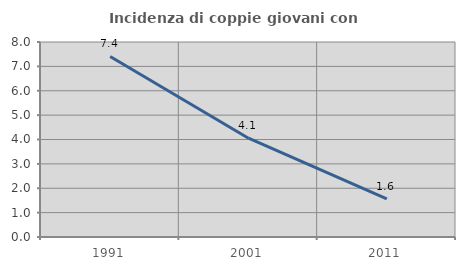
| Category | Incidenza di coppie giovani con figli |
|---|---|
| 1991.0 | 7.407 |
| 2001.0 | 4.054 |
| 2011.0 | 1.562 |